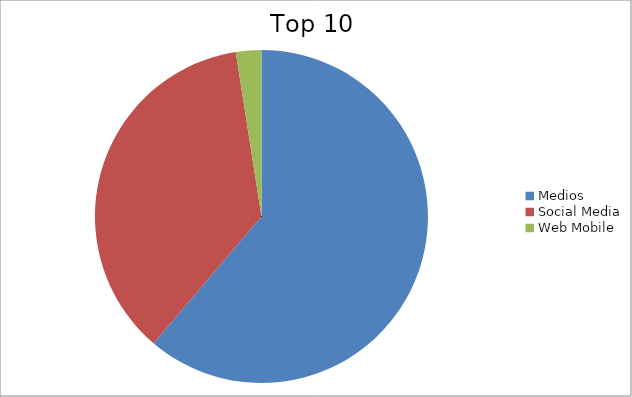
| Category | Series 0 |
|---|---|
| Medios | 61.22 |
| Social Media | 36.3 |
| Web Mobile | 2.47 |